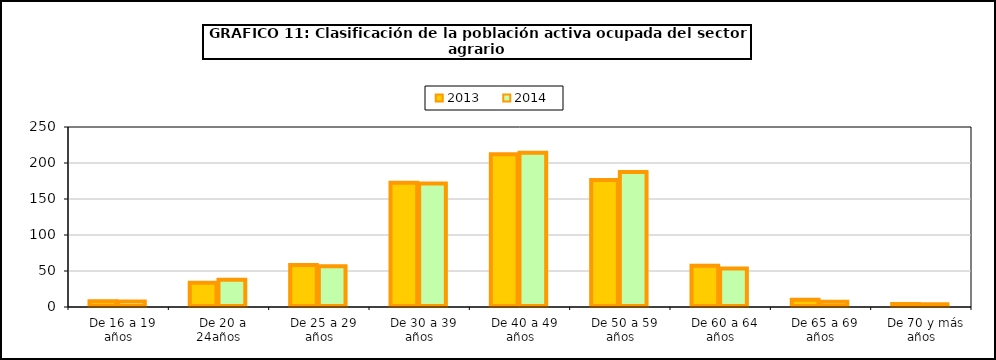
| Category | 2013 | 2014 |
|---|---|---|
|   De 16 a 19 años | 8 | 7.7 |
|   De 20 a 24años | 33.7 | 37.7 |
|   De 25 a 29 años | 58.4 | 56.6 |
|   De 30 a 39 años | 172.4 | 171.7 |
|   De 40 a 49 años | 212.2 | 214.2 |
|   De 50 a 59 años | 176.3 | 187.5 |
|   De 60 a 64 años | 57.2 | 53.6 |
|   De 65 a 69 años | 10.2 | 7.2 |
|   De 70 y más años | 4.2 | 3.8 |